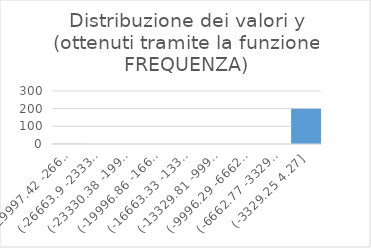
| Category | Series 0 |
|---|---|
| (-29997.42 -26663.9] | 1 |
| (-26663.9 -23330.38] | 0 |
| (-23330.38 -19996.86] | 0 |
| (-19996.86 -16663.33] | 0 |
| (-16663.33 -13329.81] | 0 |
| (-13329.81 -9996.29] | 0 |
| (-9996.29 -6662.77] | 0 |
| (-6662.77 -3329.25] | 0 |
| (-3329.25 4.27] | 199 |